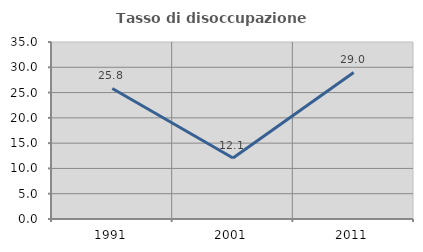
| Category | Tasso di disoccupazione giovanile  |
|---|---|
| 1991.0 | 25.806 |
| 2001.0 | 12.069 |
| 2011.0 | 28.986 |